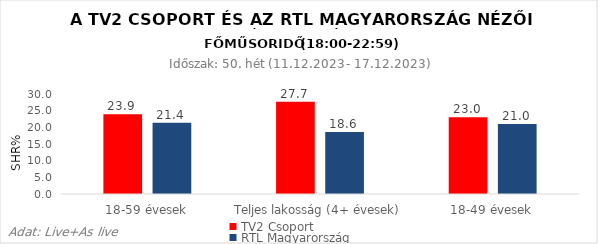
| Category | TV2 Csoport | RTL Magyarország |
|---|---|---|
| 18-59 évesek | 23.9 | 21.4 |
| Teljes lakosság (4+ évesek) | 27.7 | 18.6 |
| 18-49 évesek | 23 | 21 |